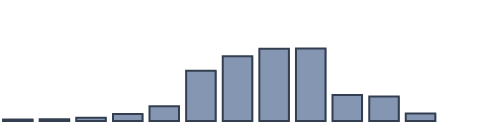
| Category | Series 0 |
|---|---|
| 0 | 0.425 |
| 1 | 0.477 |
| 2 | 0.916 |
| 3 | 2.008 |
| 4 | 4.256 |
| 5 | 14.56 |
| 6 | 18.765 |
| 7 | 20.885 |
| 8 | 20.966 |
| 9 | 7.517 |
| 10 | 7.058 |
| 11 | 2.167 |
| 12 | 0 |